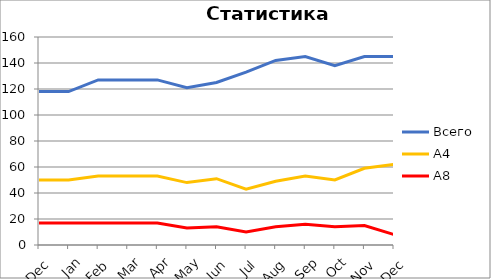
| Category | Всего | А4 | A8 |
|---|---|---|---|
| 0 | 118 | 50 | 17 |
| 1 | 118 | 50 | 17 |
| 2 | 127 | 53 | 17 |
| 3 | 127 | 53 | 17 |
| 4 | 127 | 53 | 17 |
| 5 | 121 | 48 | 13 |
| 6 | 125 | 51 | 14 |
| 7 | 133 | 43 | 10 |
| 8 | 142 | 49 | 14 |
| 9 | 145 | 53 | 16 |
| 10 | 138 | 50 | 14 |
| 11 | 145 | 59 | 15 |
| 12 | 145 | 62 | 8 |